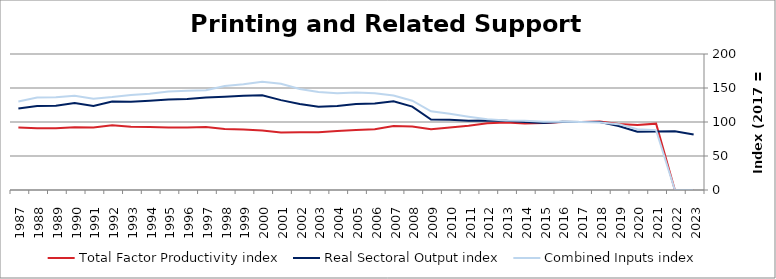
| Category | Total Factor Productivity index | Real Sectoral Output index | Combined Inputs index |
|---|---|---|---|
| 2023.0 | 0 | 81.471 | 0 |
| 2022.0 | 0 | 86.268 | 0 |
| 2021.0 | 97.553 | 85.933 | 88.089 |
| 2020.0 | 95.707 | 85.557 | 89.394 |
| 2019.0 | 97.167 | 94.11 | 96.854 |
| 2018.0 | 100.857 | 100.019 | 99.169 |
| 2017.0 | 100 | 100 | 100 |
| 2016.0 | 100.042 | 100.498 | 100.455 |
| 2015.0 | 98.353 | 98.642 | 100.294 |
| 2014.0 | 97.898 | 99.815 | 101.958 |
| 2013.0 | 99.412 | 101.727 | 102.329 |
| 2012.0 | 98.283 | 102.116 | 103.9 |
| 2011.0 | 94.537 | 101.885 | 107.773 |
| 2010.0 | 91.99 | 103.261 | 112.252 |
| 2009.0 | 89.443 | 103.542 | 115.762 |
| 2008.0 | 93.427 | 122.676 | 131.306 |
| 2007.0 | 94.011 | 130.516 | 138.83 |
| 2006.0 | 89.407 | 127.211 | 142.283 |
| 2005.0 | 88.259 | 126.439 | 143.259 |
| 2004.0 | 86.747 | 123.484 | 142.349 |
| 2003.0 | 84.956 | 122.411 | 144.087 |
| 2002.0 | 85.109 | 126.476 | 148.605 |
| 2001.0 | 84.558 | 132.181 | 156.32 |
| 2000.0 | 87.491 | 139.249 | 159.158 |
| 1999.0 | 89.005 | 138.444 | 155.546 |
| 1998.0 | 89.672 | 137.243 | 153.05 |
| 1997.0 | 92.697 | 136.11 | 146.833 |
| 1996.0 | 91.771 | 133.875 | 145.88 |
| 1995.0 | 91.977 | 133.116 | 144.727 |
| 1994.0 | 92.784 | 131.256 | 141.463 |
| 1993.0 | 92.882 | 129.831 | 139.78 |
| 1992.0 | 95.183 | 130.083 | 136.665 |
| 1991.0 | 91.982 | 123.528 | 134.296 |
| 1990.0 | 92.229 | 127.935 | 138.715 |
| 1989.0 | 90.876 | 123.912 | 136.353 |
| 1988.0 | 90.931 | 123.532 | 135.853 |
| 1987.0 | 92.04 | 119.875 | 130.241 |